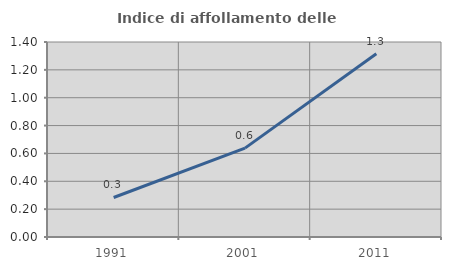
| Category | Indice di affollamento delle abitazioni  |
|---|---|
| 1991.0 | 0.284 |
| 2001.0 | 0.638 |
| 2011.0 | 1.316 |